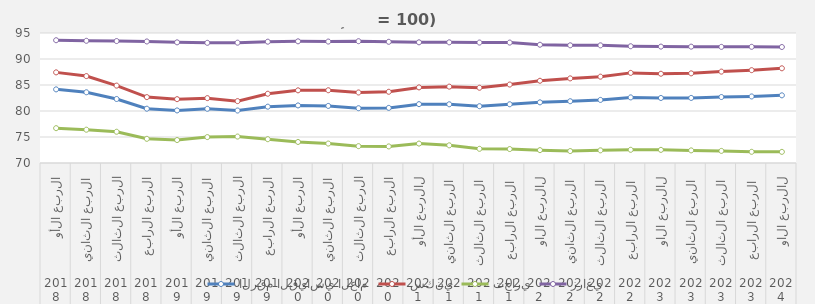
| Category | الرقم القياسي العام | سكني | تجاري | زراعي |
|---|---|---|---|---|
| 0 | 84.16 | 87.43 | 76.7 | 93.61 |
| 1 | 83.603 | 86.713 | 76.403 | 93.5 |
| 2 | 82.31 | 84.883 | 76.01 | 93.45 |
| 3 | 80.443 | 82.67 | 74.65 | 93.37 |
| 4 | 80.11 | 82.277 | 74.417 | 93.203 |
| 5 | 80.427 | 82.473 | 74.983 | 93.11 |
| 6 | 80.093 | 81.9 | 75.083 | 93.14 |
| 7 | 80.833 | 83.32 | 74.577 | 93.33 |
| 8 | 81.07 | 83.973 | 74.047 | 93.397 |
| 9 | 80.977 | 83.99 | 73.74 | 93.353 |
| 10 | 80.538 | 83.562 | 73.242 | 93.424 |
| 11 | 80.6 | 83.696 | 73.187 | 93.307 |
| 12 | 81.315 | 84.54 | 73.736 | 93.206 |
| 13 | 81.291 | 84.687 | 73.398 | 93.204 |
| 14 | 80.925 | 84.473 | 72.728 | 93.164 |
| 15 | 81.295 | 85.089 | 72.682 | 93.157 |
| 16 | 81.662 | 85.816 | 72.474 | 92.745 |
| 17 | 81.879 | 86.272 | 72.295 | 92.633 |
| 18 | 82.132 | 86.603 | 72.433 | 92.625 |
| 19 | 82.616 | 87.33 | 72.541 | 92.453 |
| 20 | 82.506 | 87.165 | 72.527 | 92.384 |
| 21 | 82.516 | 87.24 | 72.425 | 92.376 |
| 22 | 82.687 | 87.574 | 72.328 | 92.332 |
| 23 | 82.797 | 87.853 | 72.152 | 92.343 |
| 24 | 83.013 | 88.213 | 72.141 | 92.306 |